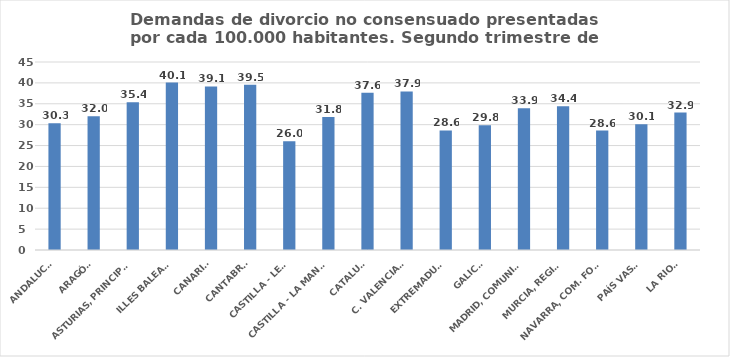
| Category | Series 0 |
|---|---|
| ANDALUCÍA | 30.319 |
| ARAGÓN | 31.991 |
| ASTURIAS, PRINCIPADO | 35.391 |
| ILLES BALEARS | 40.091 |
| CANARIAS | 39.146 |
| CANTABRIA | 39.534 |
| CASTILLA - LEÓN | 26.036 |
| CASTILLA - LA MANCHA | 31.839 |
| CATALUÑA | 37.644 |
| C. VALENCIANA | 37.945 |
| EXTREMADURA | 28.618 |
| GALICIA | 29.841 |
| MADRID, COMUNIDAD | 33.904 |
| MURCIA, REGIÓN | 34.389 |
| NAVARRA, COM. FORAL | 28.592 |
| PAÍS VASCO | 30.101 |
| LA RIOJA | 32.892 |